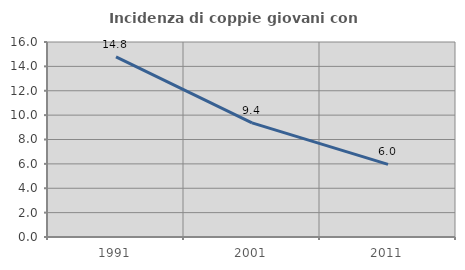
| Category | Incidenza di coppie giovani con figli |
|---|---|
| 1991.0 | 14.783 |
| 2001.0 | 9.36 |
| 2011.0 | 5.955 |